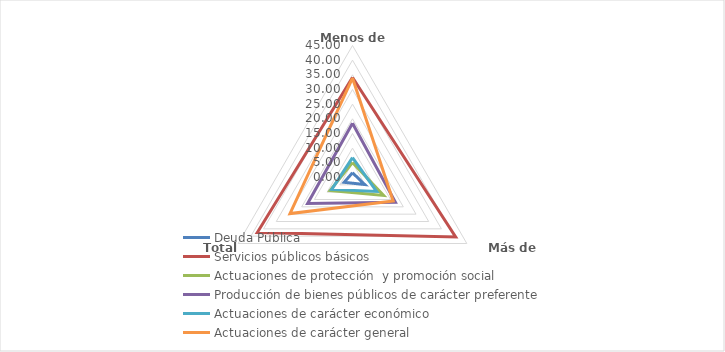
| Category | Deuda Pública | Servicios públicos básicos | Actuaciones de protección  y promoción social | Producción de bienes públicos de carácter preferente | Actuaciones de carácter económico | Actuaciones de carácter general |
|---|---|---|---|---|---|---|
| Menos de 20.000 | 1.628 | 34.074 | 5.125 | 18.486 | 6.77 | 33.917 |
| Más de 20.000 | 4.796 | 40.607 | 12.23 | 16.896 | 9.468 | 16.003 |
| Total | 3.274 | 37.469 | 8.818 | 17.66 | 8.172 | 24.607 |